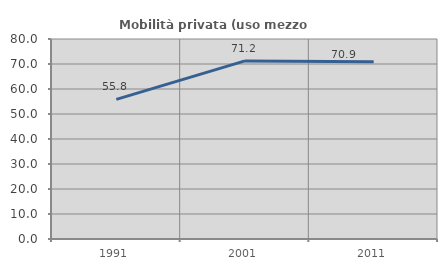
| Category | Mobilità privata (uso mezzo privato) |
|---|---|
| 1991.0 | 55.835 |
| 2001.0 | 71.242 |
| 2011.0 | 70.93 |